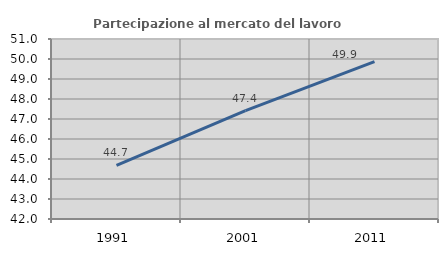
| Category | Partecipazione al mercato del lavoro  femminile |
|---|---|
| 1991.0 | 44.679 |
| 2001.0 | 47.421 |
| 2011.0 | 49.873 |